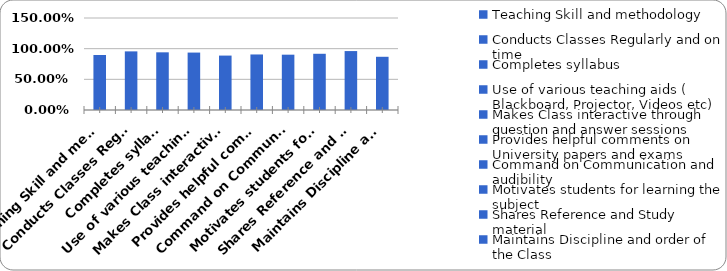
| Category | Series 0 |
|---|---|
| Teaching Skill and methodology | 0.897 |
| Conducts Classes Regularly and on time | 0.956 |
| Completes syllabus | 0.94 |
| Use of various teaching aids ( Blackboard, Projector, Videos etc) | 0.936 |
| Makes Class interactive through question and answer sessions | 0.887 |
| Provides helpful comments on University papers and exams | 0.905 |
| Command on Communication and audibility  | 0.902 |
| Motivates students for learning the subject | 0.917 |
| Shares Reference and Study material  | 0.961 |
| Maintains Discipline and order of the Class | 0.868 |